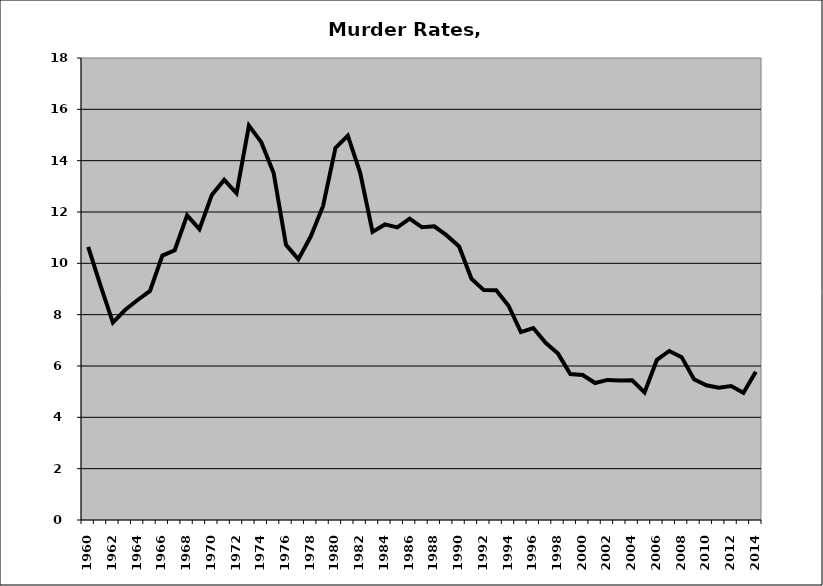
| Category | Murder |
|---|---|
| 1960.0 | 10.643 |
| 1961.0 | 9.134 |
| 1962.0 | 7.694 |
| 1963.0 | 8.192 |
| 1964.0 | 8.571 |
| 1965.0 | 8.923 |
| 1966.0 | 10.301 |
| 1967.0 | 10.509 |
| 1968.0 | 11.867 |
| 1969.0 | 11.331 |
| 1970.0 | 12.667 |
| 1971.0 | 13.251 |
| 1972.0 | 12.729 |
| 1973.0 | 15.369 |
| 1974.0 | 14.722 |
| 1975.0 | 13.522 |
| 1976.0 | 10.723 |
| 1977.0 | 10.163 |
| 1978.0 | 11.043 |
| 1979.0 | 12.235 |
| 1980.0 | 14.498 |
| 1981.0 | 14.971 |
| 1982.0 | 13.527 |
| 1983.0 | 11.227 |
| 1984.0 | 11.516 |
| 1985.0 | 11.402 |
| 1986.0 | 11.743 |
| 1987.0 | 11.403 |
| 1988.0 | 11.441 |
| 1989.0 | 11.088 |
| 1990.0 | 10.659 |
| 1991.0 | 9.4 |
| 1992.0 | 8.956 |
| 1993.0 | 8.948 |
| 1994.0 | 8.349 |
| 1995.0 | 7.32 |
| 1996.0 | 7.479 |
| 1997.0 | 6.906 |
| 1998.0 | 6.483 |
| 1999.0 | 5.685 |
| 2000.0 | 5.65 |
| 2001.0 | 5.338 |
| 2002.0 | 5.458 |
| 2003.0 | 5.436 |
| 2004.0 | 5.441 |
| 2005.0 | 4.97 |
| 2006.0 | 6.241 |
| 2007.0 | 6.586 |
| 2008.0 | 6.345 |
| 2009.0 | 5.486 |
| 2010.0 | 5.25 |
| 2011.0 | 5.157 |
| 2012.0 | 5.222 |
| 2013.0 | 4.959 |
| 2014.0 | 5.776 |